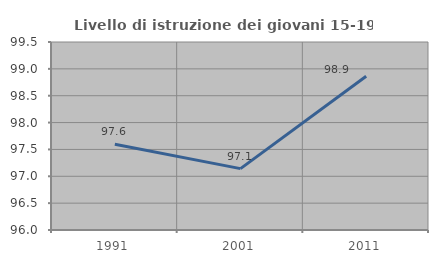
| Category | Livello di istruzione dei giovani 15-19 anni |
|---|---|
| 1991.0 | 97.596 |
| 2001.0 | 97.143 |
| 2011.0 | 98.864 |